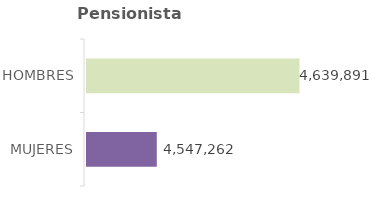
| Category | Series 0 | Series 1 |
|---|---|---|
| MUJERES | 4547262 |  |
| HOMBRES | 4639891 |  |